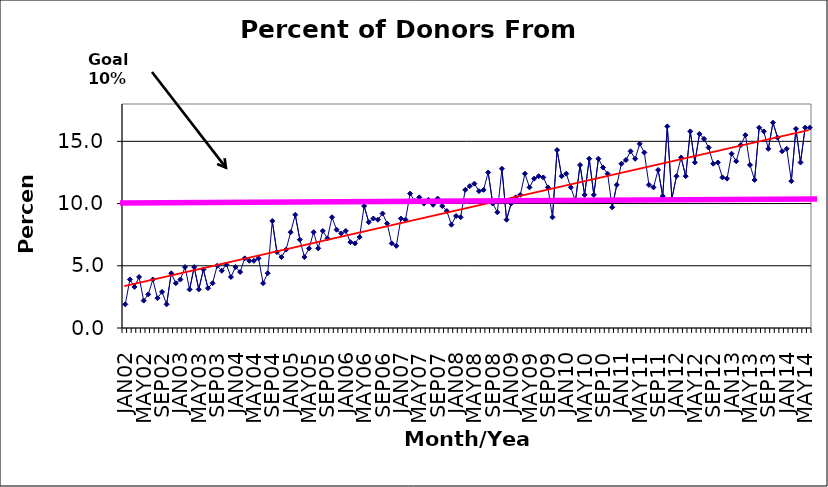
| Category | Series 0 |
|---|---|
| JAN02 | 1.9 |
| FEB02 | 3.9 |
| MAR02 | 3.3 |
| APR02 | 4.1 |
| MAY02 | 2.2 |
| JUN02 | 2.7 |
| JUL02 | 3.9 |
| AUG02 | 2.4 |
| SEP02 | 2.9 |
| OCT02 | 1.9 |
| NOV02 | 4.4 |
| DEC02 | 3.6 |
| JAN03 | 3.9 |
| FEB03 | 4.9 |
| MAR03 | 3.1 |
| APR03 | 4.9 |
| MAY03 | 3.1 |
| JUN03 | 4.7 |
| JUL03 | 3.2 |
| AUG03 | 3.6 |
| SEP03 | 5 |
| OCT03 | 4.6 |
| NOV03 | 5.1 |
| DEC03 | 4.1 |
| JAN04 | 4.9 |
| FEB04 | 4.5 |
| MAR04 | 5.6 |
| APR04 | 5.4 |
| MAY04 | 5.4 |
| JUN04 | 5.6 |
| JUL04 | 3.6 |
| AUG04 | 4.4 |
| SEP04 | 8.6 |
| OCT04 | 6.1 |
| NOV04 | 5.7 |
| DEC04 | 6.3 |
| JAN05 | 7.7 |
| FEB05 | 9.1 |
| MAR05 | 7.1 |
| APR05 | 5.7 |
| MAY05 | 6.4 |
| JUN05 | 7.7 |
| JUL05 | 6.4 |
| AUG05 | 7.8 |
| SEP05 | 7.2 |
| OCT05 | 8.9 |
| NOV05 | 7.9 |
| DEC05 | 7.6 |
| JAN06 | 7.8 |
| FEB06 | 6.9 |
| MAR06 | 6.8 |
| APR06 | 7.3 |
| MAY06 | 9.8 |
| JUN06 | 8.5 |
| JUL06 | 8.8 |
| AUG06 | 8.7 |
| SEP06 | 9.2 |
| OCT06 | 8.4 |
| NOV06 | 6.8 |
| DEC06 | 6.6 |
| JAN07 | 8.8 |
| FEB07 | 8.7 |
| MAR07 | 10.8 |
| APR07 | 10.2 |
| MAY07 | 10.5 |
| JUN07 | 10 |
| JUL07 | 10.3 |
| AUG07 | 9.9 |
| SEP07 | 10.4 |
| OCT07 | 9.8 |
| NOV07 | 9.4 |
| DEC07 | 8.3 |
| JAN08 | 9 |
| FEB08 | 8.9 |
| MAR08 | 11.1 |
| APR08 | 11.4 |
| MAY08 | 11.6 |
| JUN08 | 11 |
| JUL08 | 11.1 |
| AUG08 | 12.5 |
| SEP08 | 10 |
| OCT08 | 9.3 |
| NOV08 | 12.8 |
| DEC08 | 8.7 |
| JAN09 | 10 |
| FEB09 | 10.5 |
| MAR09 | 10.7 |
| APR09 | 12.4 |
| MAY09 | 11.3 |
| JUN09 | 12 |
| JUL09 | 12.2 |
| AUG09 | 12.1 |
| SEP09 | 11.3 |
| OCT09 | 8.9 |
| NOV09 | 14.3 |
| DEC09 | 12.2 |
| JAN10 | 12.4 |
| FEB10 | 11.3 |
| MAR10 | 10.2 |
| APR10 | 13.1 |
| MAY10 | 10.7 |
| JUN10 | 13.6 |
| JUL10 | 10.7 |
| AUG10 | 13.6 |
| SEP10 | 12.9 |
| OCT10 | 12.4 |
| NOV10 | 9.7 |
| DEC10 | 11.5 |
| JAN11 | 13.2 |
| FEB11 | 13.5 |
| MAR11 | 14.2 |
| APR11 | 13.6 |
| MAY11 | 14.8 |
| JUN11 | 14.1 |
| JUL11 | 11.5 |
| AUG11 | 11.3 |
| SEP11 | 12.7 |
| OCT11 | 10.6 |
| NOV11 | 16.2 |
| DEC11 | 10.4 |
| JAN12 | 12.2 |
| FEB12 | 13.7 |
| MAR12 | 12.2 |
| APR12 | 15.8 |
| MAY12 | 13.3 |
| JUN12 | 15.6 |
| JUL12 | 15.2 |
| AUG12 | 14.5 |
| SEP12 | 13.2 |
| OCT12 | 13.3 |
| NOV12 | 12.1 |
| DEC12 | 12 |
| JAN13 | 14 |
| FEB13 | 13.4 |
| MAR13 | 14.7 |
| APR13 | 15.5 |
| MAY13 | 13.1 |
| JUN13 | 11.9 |
| JUL13 | 16.1 |
| AUG13 | 15.8 |
| SEP13 | 14.4 |
| OCT13 | 16.5 |
| NOV13 | 15.3 |
| DEC13 | 14.2 |
| JAN14 | 14.4 |
| FEB14 | 11.8 |
| MAR14 | 16 |
| APR14 | 13.3 |
| MAY14 | 16.1 |
| JUN14 | 16.1 |